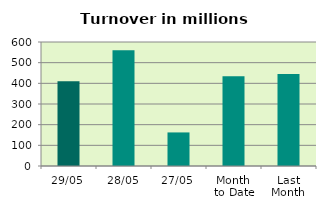
| Category | Series 0 |
|---|---|
| 29/05 | 410.675 |
| 28/05 | 560.188 |
| 27/05 | 162.428 |
| Month 
to Date | 433.733 |
| Last
Month | 444.663 |